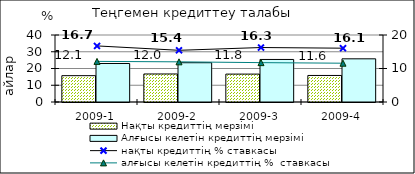
| Category | Нақты кредиттің мерзімі  | Алғысы келетін кредиттің мерзімі  |
|---|---|---|
| 2009-1 | 15.72 | 22.99 |
| 2009-2 | 16.73 | 23.45 |
| 2009-3 | 16.66 | 25.4 |
| 2009-4 | 15.84 | 25.78 |